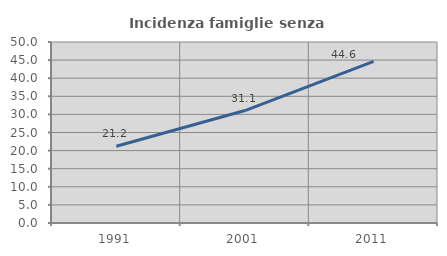
| Category | Incidenza famiglie senza nuclei |
|---|---|
| 1991.0 | 21.192 |
| 2001.0 | 31.063 |
| 2011.0 | 44.628 |